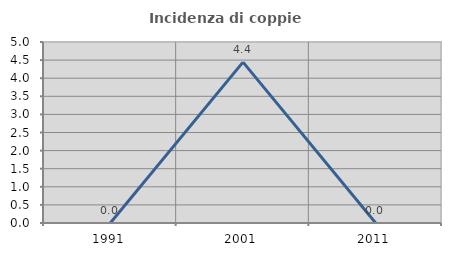
| Category | Incidenza di coppie miste |
|---|---|
| 1991.0 | 0 |
| 2001.0 | 4.444 |
| 2011.0 | 0 |